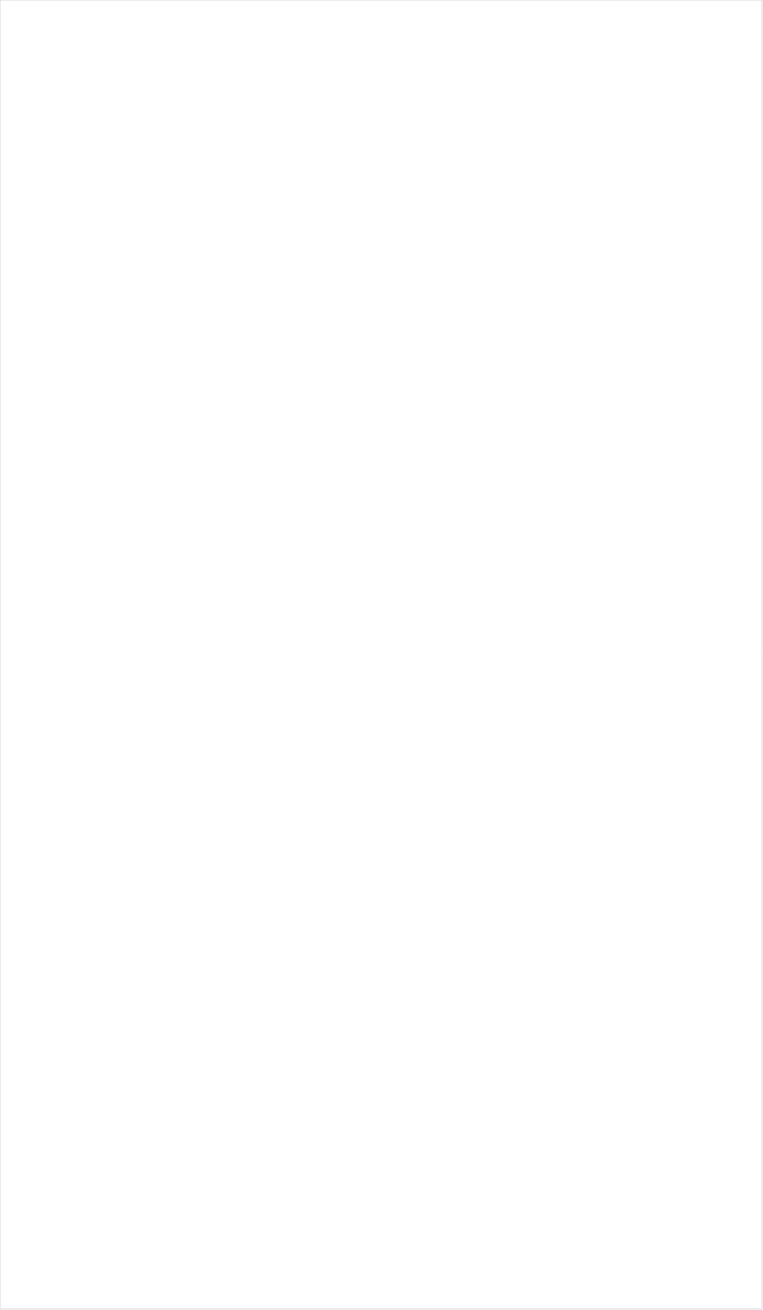
| Category | Total |
|---|---|
| Hallmark Movies & Mysteries | -0.517 |
| Univision | -0.482 |
| RFD TV | -0.477 |
| UniMas | -0.473 |
| Hallmark | -0.47 |
| Telemundo | -0.427 |
| UP TV | -0.37 |
| Galavision | -0.345 |
| Discovery Life Channel | -0.341 |
| Travel | -0.328 |
| PBS | -0.268 |
| Science Channel | -0.262 |
| Smithsonian | -0.248 |
| NBC Universo | -0.247 |
| Fox News | -0.216 |
| INSP | -0.213 |
| TLC | -0.196 |
| WGN America | -0.174 |
| Outdoor Channel | -0.168 |
| Great American Country | -0.165 |
| CBS | -0.162 |
| ION | -0.15 |
| Investigation Discovery | -0.147 |
| Fox Business | -0.146 |
| CMTV | -0.134 |
| Logo | -0.125 |
| Animal Planet | -0.12 |
| National Geographic Wild | -0.116 |
| History Channel | -0.111 |
| Discovery Channel | -0.105 |
| Weather Channel | -0.102 |
| NBC | -0.1 |
| POP | -0.088 |
| MyNetworkTV | -0.087 |
| DIY | -0.067 |
| The Sportsman Channel | -0.064 |
| TV LAND | -0.055 |
| HGTV | -0.051 |
| Headline News | -0.05 |
| ABC | -0.048 |
| OXYGEN | -0.033 |
| FYI | -0.007 |
| FOX | 0.012 |
| CW | 0.016 |
| Olympic Channel | 0.032 |
| Motor Trend Network | 0.037 |
| American Heroes Channel | 0.042 |
| Discovery Family Channel | 0.046 |
| Nick@Nite | 0.056 |
| Cartoon Network | 0.071 |
| Disney XD | 0.078 |
| Disney Junior US | 0.11 |
| TUDN | 0.118 |
| Universal Kids | 0.137 |
| Lifetime | 0.144 |
| Food Network | 0.153 |
| WE TV | 0.153 |
| Lifetime Movies | 0.159 |
| Freeform | 0.172 |
| Disney Channel | 0.18 |
| TBS | 0.202 |
| Nick Jr. | 0.202 |
| SundanceTV | 0.208 |
| Nick Toons | 0.208 |
| SYFY | 0.218 |
| Destination America | 0.223 |
| Ovation | 0.23 |
| Oprah Winfrey Network | 0.236 |
| BRAVO | 0.247 |
| Nick | 0.247 |
| Reelz Channel | 0.25 |
| Adult Swim | 0.26 |
| National Geographic | 0.266 |
| A&E | 0.27 |
| Paramount Network | 0.282 |
| AMC | 0.32 |
| FX Movie Channel | 0.33 |
| E! | 0.333 |
| Teen Nick | 0.337 |
| MTV | 0.34 |
| Game Show | 0.365 |
| Bloomberg HD | 0.365 |
| Cooking Channel | 0.405 |
| MSNBC | 0.421 |
| FX | 0.427 |
| Independent Film (IFC) | 0.434 |
| USA Network | 0.434 |
| Viceland | 0.487 |
| truTV | 0.491 |
| BBC America | 0.495 |
| CNBC | 0.532 |
| NHL | 0.592 |
| FXX | 0.659 |
| Comedy Central | 0.694 |
| TNT | 0.716 |
| FXDEP | 0.756 |
| CNN | 0.789 |
| ESPN Deportes | 0.893 |
| Golf | 0.999 |
| BET | 1.22 |
| VH1 | 1.235 |
| BET Her | 1.291 |
| Tennis Channel | 1.347 |
| Fox Sports 1 | 1.487 |
| MLB Network | 1.497 |
| NBC Sports | 1.654 |
| TV ONE | 1.742 |
| PAC-12 Network | 1.809 |
| MTV2 | 1.937 |
| Big Ten Network | 2.617 |
| ESPNEWS | 2.737 |
| CBS Sports | 2.739 |
| NFL Network | 2.812 |
| ESPN | 3.176 |
| ESPN2 | 3.343 |
| ESPNU | 4.898 |
| NBA TV | 7.537 |